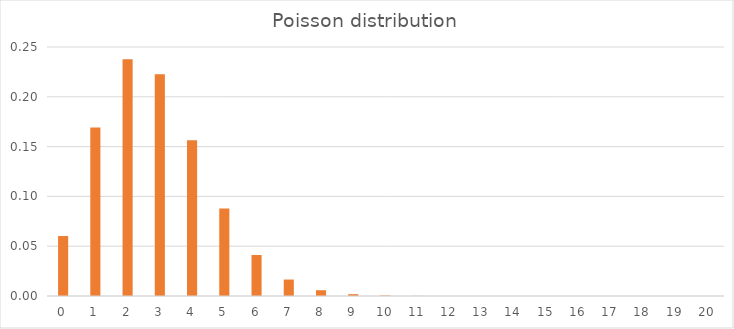
| Category | Poisson |
|---|---|
| 0.0 | 0.06 |
| 1.0 | 0.169 |
| 2.0 | 0.238 |
| 3.0 | 0.223 |
| 4.0 | 0.156 |
| 5.0 | 0.088 |
| 6.0 | 0.041 |
| 7.0 | 0.017 |
| 8.0 | 0.006 |
| 9.0 | 0.002 |
| 10.0 | 0.001 |
| 11.0 | 0 |
| 12.0 | 0 |
| 13.0 | 0 |
| 14.0 | 0 |
| 15.0 | 0 |
| 16.0 | 0 |
| 17.0 | 0 |
| 18.0 | 0 |
| 19.0 | 0 |
| 20.0 | 0 |